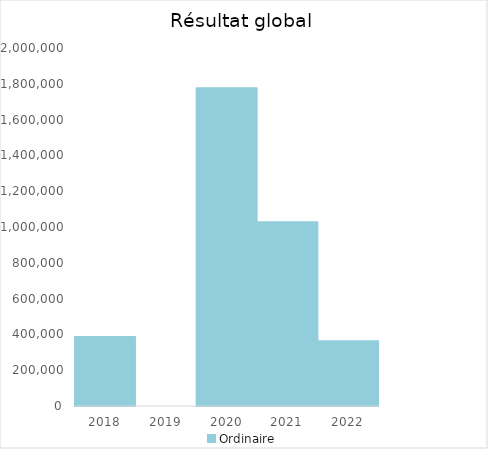
| Category |   | Ordinaire |    |
|---|---|---|---|
| 2018.0 |  | 384978.32 |  |
| 2019.0 |  | 0 |  |
| 2020.0 |  | 1774930.01 |  |
| 2021.0 |  | 1027168.23 |  |
| 2022.0 |  | 362110.32 |  |